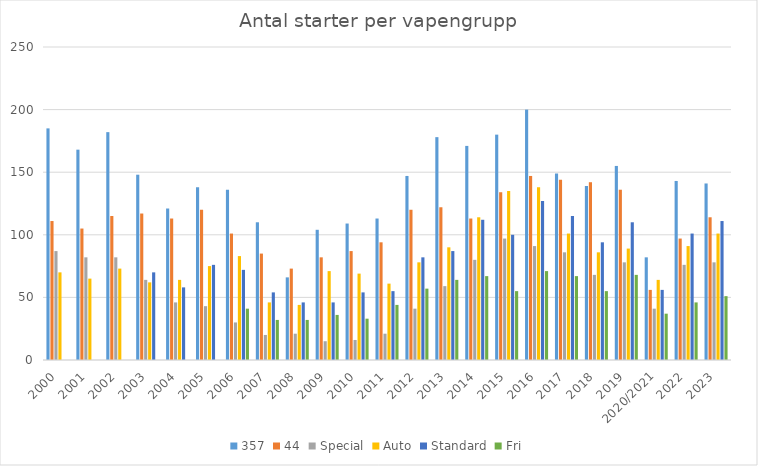
| Category | 357 | 44 | Special | Auto | Standard | Fri |
|---|---|---|---|---|---|---|
| 2000 | 185 | 111 | 87 | 70 | 0 | 0 |
| 2001 | 168 | 105 | 82 | 65 | 0 | 0 |
| 2002 | 182 | 115 | 82 | 73 | 0 | 0 |
| 2003 | 148 | 117 | 64 | 62 | 70 | 0 |
| 2004 | 121 | 113 | 46 | 64 | 58 | 0 |
| 2005 | 138 | 120 | 43 | 75 | 76 | 0 |
| 2006 | 136 | 101 | 30 | 83 | 72 | 41 |
| 2007 | 110 | 85 | 20 | 46 | 54 | 32 |
| 2008 | 66 | 73 | 21 | 44 | 46 | 32 |
| 2009 | 104 | 82 | 15 | 71 | 46 | 36 |
| 2010 | 109 | 87 | 16 | 69 | 54 | 33 |
| 2011 | 113 | 94 | 21 | 61 | 55 | 44 |
| 2012 | 147 | 120 | 41 | 78 | 82 | 57 |
| 2013 | 178 | 122 | 59 | 90 | 87 | 64 |
| 2014 | 171 | 113 | 80 | 114 | 112 | 67 |
| 2015 | 180 | 134 | 97 | 135 | 100 | 55 |
| 2016 | 200 | 147 | 91 | 138 | 127 | 71 |
| 2017 | 149 | 144 | 86 | 101 | 115 | 67 |
| 2018 | 139 | 142 | 68 | 86 | 94 | 55 |
| 2019 | 155 | 136 | 78 | 89 | 110 | 68 |
| 2020/2021 | 82 | 56 | 41 | 64 | 56 | 37 |
| 2022 | 143 | 97 | 76 | 91 | 101 | 46 |
| 2023 | 141 | 114 | 78 | 101 | 111 | 51 |